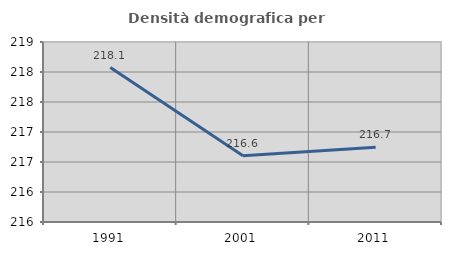
| Category | Densità demografica |
|---|---|
| 1991.0 | 218.073 |
| 2001.0 | 216.604 |
| 2011.0 | 216.746 |